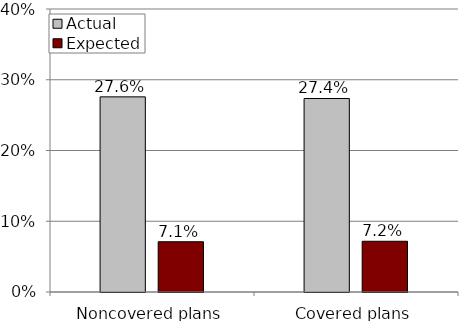
| Category | Actual | Expected |
|---|---|---|
| Noncovered plans | 0.276 | 0.071 |
| Covered plans | 0.274 | 0.072 |